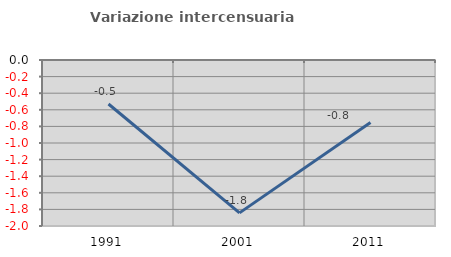
| Category | Variazione intercensuaria annua |
|---|---|
| 1991.0 | -0.53 |
| 2001.0 | -1.842 |
| 2011.0 | -0.753 |